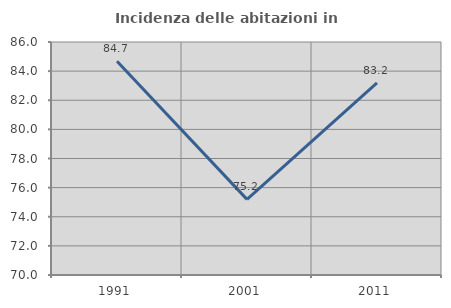
| Category | Incidenza delle abitazioni in proprietà  |
|---|---|
| 1991.0 | 84.685 |
| 2001.0 | 75.194 |
| 2011.0 | 83.186 |